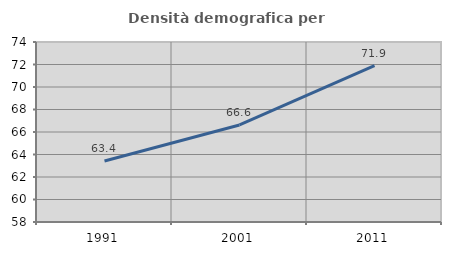
| Category | Densità demografica |
|---|---|
| 1991.0 | 63.424 |
| 2001.0 | 66.623 |
| 2011.0 | 71.902 |